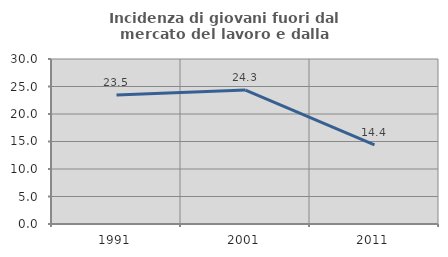
| Category | Incidenza di giovani fuori dal mercato del lavoro e dalla formazione  |
|---|---|
| 1991.0 | 23.462 |
| 2001.0 | 24.345 |
| 2011.0 | 14.377 |